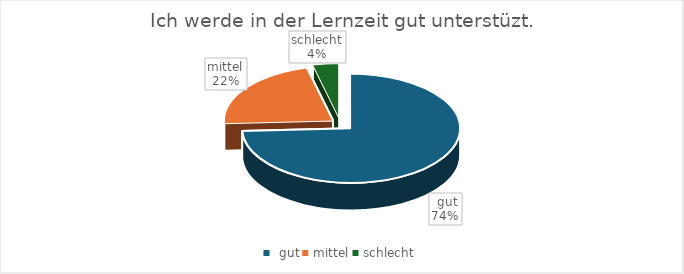
| Category | Series 0 |
|---|---|
|  gut | 115 |
| mittel | 34 |
| schlecht | 6 |